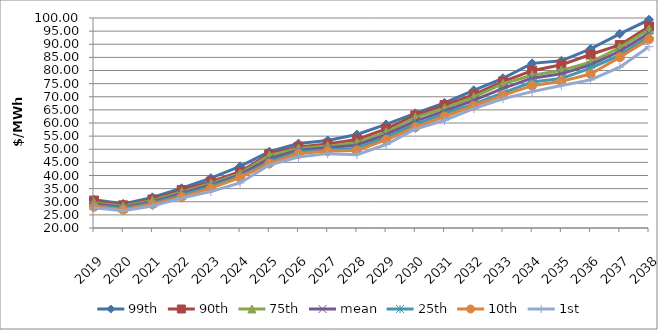
| Category | 99th | 90th | 75th | mean | 25th | 10th | 1st |
|---|---|---|---|---|---|---|---|
| 2019.0 | 30.758 | 30.455 | 29.62 | 29.201 | 28.657 | 28.121 | 27.725 |
| 2020.0 | 29.2 | 28.624 | 28.299 | 27.812 | 27.454 | 26.98 | 26.573 |
| 2021.0 | 31.674 | 30.868 | 30.512 | 29.963 | 29.494 | 29.081 | 28.407 |
| 2022.0 | 35.129 | 34.452 | 33.693 | 33.128 | 32.531 | 31.855 | 31.385 |
| 2023.0 | 39.011 | 37.648 | 36.989 | 36.384 | 35.803 | 35.164 | 33.905 |
| 2024.0 | 43.471 | 41.436 | 40.713 | 40.246 | 39.654 | 39.177 | 37.149 |
| 2025.0 | 49.055 | 48.184 | 47.63 | 46.402 | 45.216 | 44.599 | 43.977 |
| 2026.0 | 52.165 | 50.886 | 50.258 | 49.618 | 49.054 | 48.256 | 47.027 |
| 2027.0 | 53.367 | 52.018 | 51.193 | 50.562 | 49.739 | 49.296 | 48.331 |
| 2028.0 | 55.613 | 53.711 | 52.543 | 51.541 | 50.293 | 49.544 | 47.946 |
| 2029.0 | 59.467 | 57.761 | 56.488 | 55.543 | 54.524 | 53.536 | 51.795 |
| 2030.0 | 63.685 | 62.892 | 62.13 | 60.746 | 59.493 | 58.386 | 57.737 |
| 2031.0 | 67.675 | 66.817 | 65.619 | 64.508 | 63.545 | 62.473 | 61.045 |
| 2032.0 | 72.464 | 70.771 | 69.824 | 68.629 | 67.156 | 66.565 | 65.482 |
| 2033.0 | 77.042 | 75.794 | 74.948 | 73.183 | 71.487 | 70.529 | 69.23 |
| 2034.0 | 82.725 | 79.937 | 78.176 | 77.07 | 75.628 | 74.212 | 71.946 |
| 2035.0 | 83.682 | 82.161 | 80.051 | 78.737 | 76.961 | 75.865 | 74.313 |
| 2036.0 | 88.222 | 86.089 | 83.133 | 82.12 | 80.865 | 78.654 | 76.427 |
| 2037.0 | 93.953 | 89.726 | 88.741 | 87.326 | 85.87 | 85.051 | 81.263 |
| 2038.0 | 99.337 | 96.738 | 95.626 | 94.276 | 92.99 | 91.899 | 89.079 |